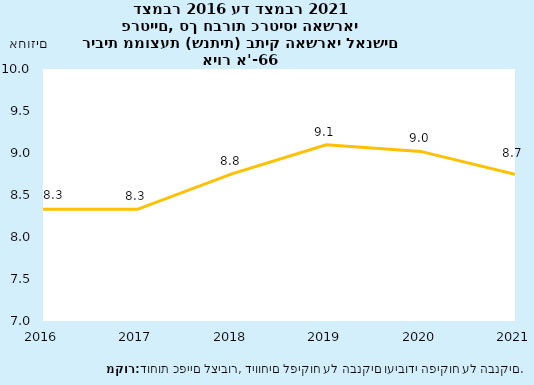
| Category | Series 0 |
|---|---|
| 2016-12-31 | 8.331 |
| 2017-12-31 | 8.33 |
| 2018-12-31 | 8.752 |
| 2019-12-31 | 9.098 |
| 2020-12-31 | 9.019 |
| 2021-12-31 | 8.746 |